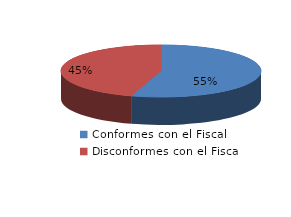
| Category | Series 0 |
|---|---|
| 0 | 814 |
| 1 | 674 |